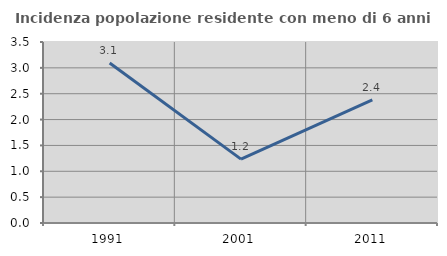
| Category | Incidenza popolazione residente con meno di 6 anni |
|---|---|
| 1991.0 | 3.093 |
| 2001.0 | 1.235 |
| 2011.0 | 2.381 |